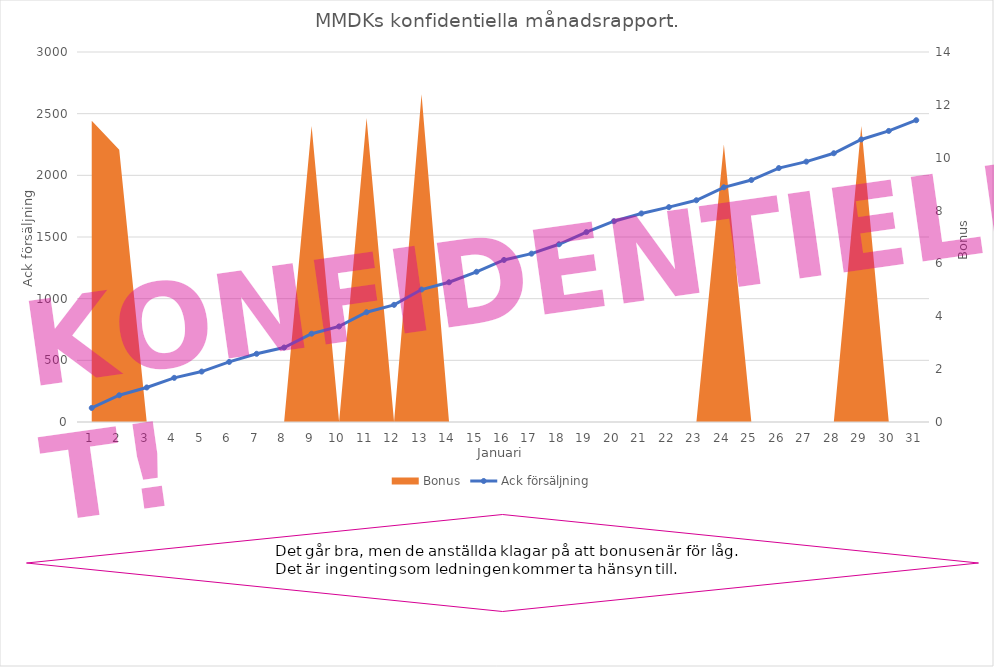
| Category | Ack försäljning |
|---|---|
| 0 | 114 |
| 1 | 217 |
| 2 | 280 |
| 3 | 358 |
| 4 | 409 |
| 5 | 487 |
| 6 | 553 |
| 7 | 604 |
| 8 | 716 |
| 9 | 775 |
| 10 | 890 |
| 11 | 950 |
| 12 | 1074 |
| 13 | 1133 |
| 14 | 1218 |
| 15 | 1314 |
| 16 | 1365 |
| 17 | 1441 |
| 18 | 1540 |
| 19 | 1628 |
| 20 | 1691 |
| 21 | 1742 |
| 22 | 1798 |
| 23 | 1903 |
| 24 | 1962 |
| 25 | 2059 |
| 26 | 2111 |
| 27 | 2179 |
| 28 | 2291 |
| 29 | 2360 |
| 30 | 2447 |